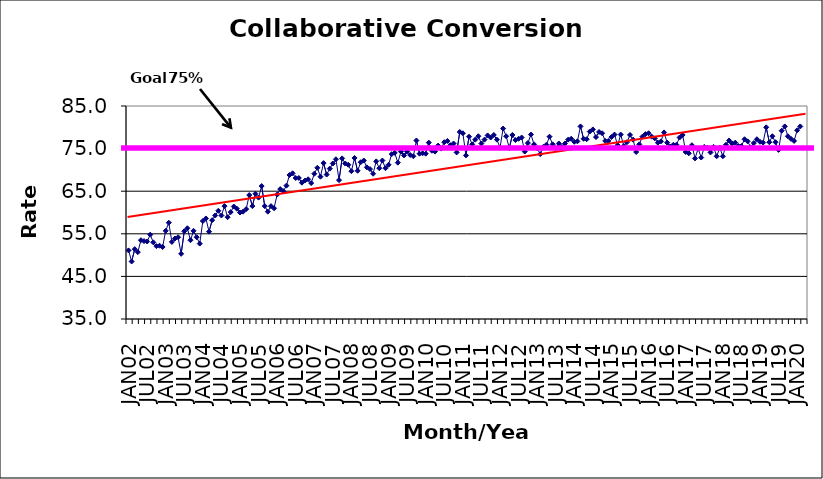
| Category | Series 0 |
|---|---|
| JAN02 | 51.1 |
| FEB02 | 48.5 |
| MAR02 | 51.4 |
| APR02 | 50.7 |
| MAY02 | 53.5 |
| JUN02 | 53.3 |
| JUL02 | 53.2 |
| AUG02 | 54.8 |
| SEP02 | 53 |
| OCT02 | 52.1 |
| NOV02 | 52.2 |
| DEC02 | 51.9 |
| JAN03 | 55.7 |
| FEB03 | 57.6 |
| MAR03 | 53.1 |
| APR03 | 53.9 |
| MAY03 | 54.2 |
| JUN03 | 50.3 |
| JUL03 | 55.6 |
| AUG03 | 56.3 |
| SEP03 | 53.5 |
| OCT03 | 55.7 |
| NOV03 | 54.2 |
| DEC03 | 52.7 |
| JAN04 | 58 |
| FEB04 | 58.6 |
| MAR04 | 55.5 |
| APR04 | 58.2 |
| MAY04 | 59.3 |
| JUN04 | 60.4 |
| JUL04 | 59.3 |
| AUG04 | 61.5 |
| SEP04 | 58.9 |
| OCT04 | 60.1 |
| NOV04 | 61.4 |
| DEC04 | 60.9 |
| JAN05 | 60 |
| FEB05 | 60.2 |
| MAR05 | 60.8 |
| APR05 | 64.1 |
| MAY05 | 61.5 |
| JUN05 | 64.4 |
| JUL05 | 63.5 |
| AUG05 | 66.2 |
| SEP05 | 61.5 |
| OCT05 | 60.2 |
| NOV05 | 61.5 |
| DEC05 | 61 |
| JAN06 | 64.2 |
| FEB06 | 65.5 |
| MAR06 | 65 |
| APR06 | 66.3 |
| MAY06 | 68.8 |
| JUN06 | 69.2 |
| JUL06 | 68.1 |
| AUG06 | 68.1 |
| SEP06 | 67 |
| OCT06 | 67.5 |
| NOV06 | 67.8 |
| DEC06 | 66.9 |
| JAN07 | 69.1 |
| FEB07 | 70.5 |
| MAR07 | 68.4 |
| APR07 | 71.6 |
| MAY07 | 68.9 |
| JUN07 | 70.3 |
| JUL07 | 71.5 |
| AUG07 | 72.5 |
| SEP07 | 67.6 |
| OCT07 | 72.7 |
| NOV07 | 71.5 |
| DEC07 | 71.2 |
| JAN08 | 69.7 |
| FEB08 | 72.8 |
| MAR08 | 69.8 |
| APR08 | 71.8 |
| MAY08 | 72.2 |
| JUN08 | 70.6 |
| JUL08 | 70.2 |
| AUG08 | 69.1 |
| SEP08 | 72 |
| OCT08 | 70.4 |
| NOV08 | 72.2 |
| DEC08 | 70.4 |
| JAN09 | 71.2 |
| FEB09 | 73.7 |
| MAR09 | 74 |
| APR09 | 71.7 |
| MAY09 | 74.3 |
| JUN09 | 73.4 |
| JUL09 | 74.3 |
| AUG09 | 73.5 |
| SEP09 | 73.2 |
| OCT09 | 76.9 |
| NOV09 | 73.8 |
| DEC09 | 73.9 |
| JAN10 | 73.8 |
| FEB10 | 76.4 |
| MAR10 | 74.5 |
| APR10 | 74.3 |
| MAY10 | 75.7 |
| JUN10 | 75 |
| JUL10 | 76.5 |
| AUG10 | 76.8 |
| SEP10 | 75.8 |
| OCT10 | 76.2 |
| NOV10 | 74.1 |
| DEC10 | 78.9 |
| JAN11 | 78.6 |
| FEB11 | 73.4 |
| MAR11 | 77.8 |
| APR11 | 76 |
| MAY11 | 77.1 |
| JUN11 | 77.9 |
| JUL11 | 76.2 |
| AUG11 | 77.1 |
| SEP11 | 78.1 |
| OCT11 | 77.6 |
| NOV11 | 78.2 |
| DEC11 | 77.1 |
| JAN12 | 75.2 |
| FEB12 | 79.7 |
| MAR12 | 77.9 |
| APR12 | 75.1 |
| MAY12 | 78.2 |
| JUN12 | 77 |
| JUL12 | 77.3 |
| AUG12 | 77.6 |
| SEP12 | 74.3 |
| OCT12 | 76.3 |
| NOV12 | 78.3 |
| DEC12 | 76 |
| JAN13 | 75.1 |
| FEB13 | 73.7 |
| MAR13 | 75.4 |
| APR13 | 75.9 |
| MAY13 | 77.8 |
| JUN13 | 76 |
| JUL13 | 75.1 |
| AUG13 | 76.2 |
| SEP13 | 75.4 |
| OCT13 | 76.2 |
| NOV13 | 77.1 |
| DEC13 | 77.3 |
| JAN14 | 76.6 |
| FEB14 | 76.7 |
| MAR14 | 80.2 |
| APR14 | 77.3 |
| MAY14 | 77.2 |
| JUN14 | 79 |
| JUL14 | 79.5 |
| AUG14 | 77.7 |
| SEP14 | 78.9 |
| OCT14 | 78.6 |
| NOV14 | 76.8 |
| DEC14 | 76.8 |
| JAN15 | 77.7 |
| FEB15 | 78.3 |
| MAR15 | 75.8 |
| APR15 | 78.3 |
| MAY15 | 75.6 |
| JUN15 | 76.5 |
| JUL15 | 78.2 |
| AUG15 | 77.1 |
| SEP15 | 74.2 |
| OCT15 | 76 |
| NOV15 | 77.8 |
| DEC15 | 78.4 |
| JAN16 | 78.6 |
| FEB16 | 77.8 |
| MAR16 | 77.4 |
| APR16 | 76.4 |
| MAY16 | 76.7 |
| JUN16 | 78.8 |
| JUL16 | 76.4 |
| AUG16 | 75.5 |
| SEP16 | 75.9 |
| OCT16 | 75.9 |
| NOV16 | 77.6 |
| DEC16 | 78.2 |
| JAN17 | 74.2 |
| FEB17 | 73.9 |
| MAR17 | 75.8 |
| APR17 | 72.7 |
| MAY17 | 75 |
| JUN17 | 72.9 |
| JUL17 | 75.4 |
| AUG17 | 75.2 |
| SEP17 | 74.1 |
| OCT17 | 75.4 |
| NOV17 | 73.2 |
| DEC17 | 75.2 |
| JAN18 | 73.2 |
| FEB18 | 75.9 |
| MAR18 | 76.9 |
| APR18 | 76.2 |
| MAY18 | 76.4 |
| JUN18 | 75.6 |
| JUL18 | 75.6 |
| AUG18 | 77.2 |
| SEP18 | 76.7 |
| OCT18 | 75.3 |
| NOV18 | 76.3 |
| DEC18 | 77.2 |
| JAN19 | 76.6 |
| FEB19 | 76.4 |
| MAR19 | 80 |
| APR19 | 76.5 |
| MAY19 | 77.9 |
| JUN19 | 76.5 |
| JUL19 | 74.7 |
| AUG19 | 79.2 |
| SEP19 | 80.2 |
| OCT19 | 77.9 |
| NOV19 | 77.3 |
| DEC19 | 76.8 |
| JAN20 | 79.3 |
| FEB20 | 80.2 |